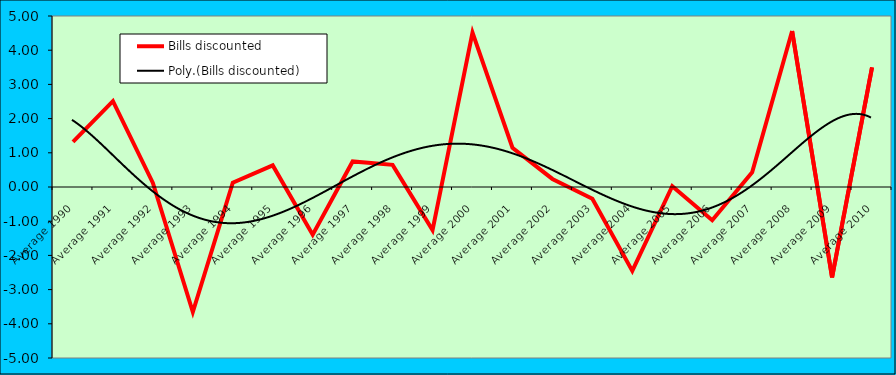
| Category | Bills discounted |
|---|---|
| Average 1990 | 1.317 |
| Average 1991 | 2.509 |
| Average 1992 | 0.118 |
| Average 1993 | -3.657 |
| Average 1994 | 0.125 |
| Average 1995 | 0.632 |
| Average 1996 | -1.397 |
| Average 1997 | 0.747 |
| Average 1998 | 0.647 |
| Average 1999 | -1.26 |
| Average 2000 | 4.514 |
| Average 2001 | 1.148 |
| Average 2002 | 0.236 |
| Average 2003 | -0.341 |
| Average 2004 | -2.452 |
| Average 2005 | 0.023 |
| Average 2006 | -0.971 |
| Average 2007 | 0.427 |
| Average 2008 | 4.562 |
| Average 2009 | -2.646 |
| Average 2010 | 3.498 |